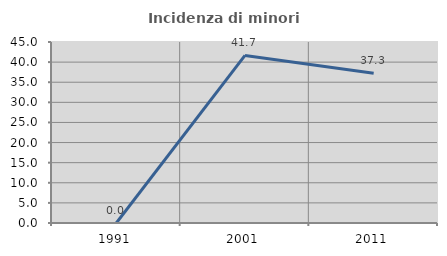
| Category | Incidenza di minori stranieri |
|---|---|
| 1991.0 | 0 |
| 2001.0 | 41.667 |
| 2011.0 | 37.255 |